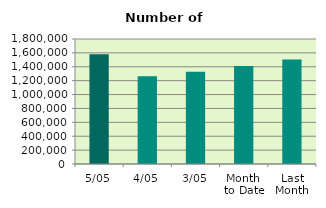
| Category | Series 0 |
|---|---|
| 5/05 | 1580420 |
| 4/05 | 1264550 |
| 3/05 | 1328442 |
| Month 
to Date | 1411025.5 |
| Last
Month | 1505043.474 |